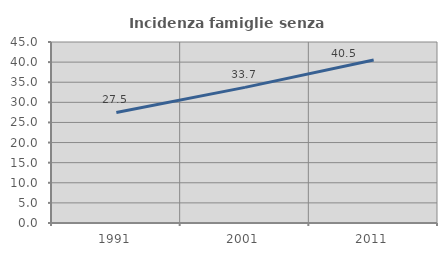
| Category | Incidenza famiglie senza nuclei |
|---|---|
| 1991.0 | 27.473 |
| 2001.0 | 33.721 |
| 2011.0 | 40.504 |